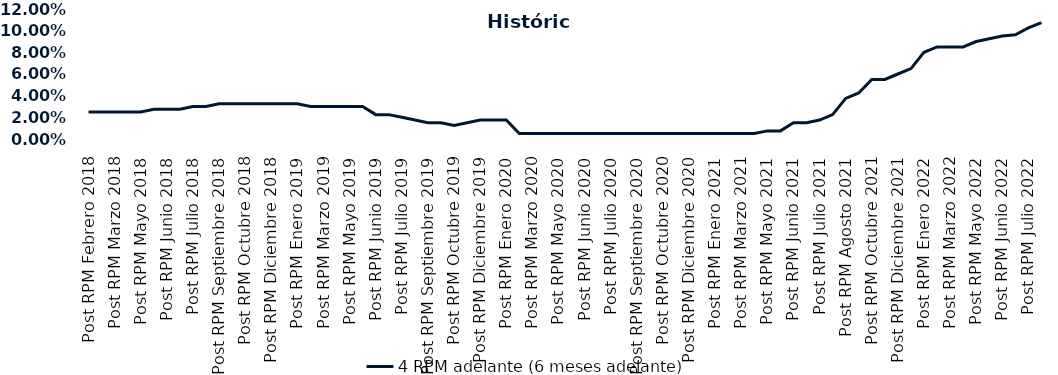
| Category | 4 RPM adelante (6 meses adelante) |
|---|---|
| Post RPM Febrero 2018 | 0.025 |
| Pre RPM Marzo 2018 | 0.025 |
| Post RPM Marzo 2018 | 0.025 |
| Pre RPM Mayo 2018 | 0.025 |
| Post RPM Mayo 2018 | 0.025 |
| Pre RPM Junio 2018 | 0.028 |
| Post RPM Junio 2018 | 0.028 |
| Pre RPM Julio 2018 | 0.028 |
| Post RPM Julio 2018 | 0.03 |
| Pre RPM Septiembre 2018 | 0.03 |
| Post RPM Septiembre 2018 | 0.032 |
| Pre RPM Octubre 2018 | 0.032 |
| Post RPM Octubre 2018 | 0.032 |
| Pre RPM Diciembre 2018 | 0.032 |
| Post RPM Diciembre 2018 | 0.032 |
| Pre RPM Enero 2019 | 0.032 |
| Post RPM Enero 2019 | 0.032 |
| Pre RPM Marzo 2019 | 0.03 |
| Post RPM Marzo 2019 | 0.03 |
| Pre RPM Mayo 2019 | 0.03 |
| Post RPM Mayo 2019 | 0.03 |
| Pre RPM Junio 2019 | 0.03 |
| Post RPM Junio 2019 | 0.022 |
| Pre RPM Julio 2019 | 0.022 |
| Post RPM Julio 2019 | 0.02 |
| Pre RPM Septiembre 2019 | 0.018 |
| Post RPM Septiembre 2019 | 0.015 |
| Pre RPM Octubre 2019 | 0.015 |
| Post RPM Octubre 2019 | 0.012 |
| Pre RPM Diciembre 2019 | 0.015 |
| Post RPM Diciembre 2019 | 0.018 |
| Pre RPM Enero 2020 | 0.018 |
| Post RPM Enero 2020 | 0.018 |
| Pre RPM Marzo 2020 | 0.005 |
| Post RPM Marzo 2020 | 0.005 |
| Pre RPM Mayo 2020 | 0.005 |
| Post RPM Mayo 2020 | 0.005 |
| Pre RPM Junio 2020 | 0.005 |
| Post RPM Junio 2020 | 0.005 |
| Pre RPM Julio 2020 | 0.005 |
| Post RPM Julio 2020 | 0.005 |
| Pre RPM Septiembre 2020 | 0.005 |
| Post RPM Septiembre 2020 | 0.005 |
| Pre RPM Octubre 2020 | 0.005 |
| Post RPM Octubre 2020 | 0.005 |
| Pre RPM Diciembre 2020 | 0.005 |
| Post RPM Diciembre 2020 | 0.005 |
| Pre RPM Enero 2021 | 0.005 |
| Post RPM Enero 2021 | 0.005 |
| Pre RPM Marzo 2021 | 0.005 |
| Post RPM Marzo 2021 | 0.005 |
| Pre RPM Mayo 2021 | 0.005 |
| Post RPM Mayo 2021 | 0.008 |
| Pre RPM Junio 2021 | 0.008 |
| Post RPM Junio 2021 | 0.015 |
| Pre RPM Julio 2021 | 0.015 |
| Post RPM Julio 2021 | 0.018 |
| Pre RPM Agosto 2021 | 0.022 |
| Post RPM Agosto 2021 | 0.038 |
| Pre RPM Octubre 2021 | 0.042 |
| Post RPM Octubre 2021 | 0.055 |
| Pre RPM Diciembre 2021 | 0.055 |
| Post RPM Diciembre 2021 | 0.06 |
| Pre RPM Enero 2022 | 0.065 |
| Post RPM Enero 2022 | 0.08 |
| Pre RPM Marzo 2022 | 0.085 |
| Post RPM Marzo 2022 | 0.085 |
| Pre RPM Mayo 2022 | 0.085 |
| Post RPM Mayo 2022 | 0.09 |
| Pre RPM Junio 2022 | 0.092 |
| Post RPM Junio 2022 | 0.095 |
| Pre RPM Julio 2022 | 0.096 |
| Post RPM Julio 2022 | 0.102 |
| Pre RPM Septiembre 2022 | 0.108 |